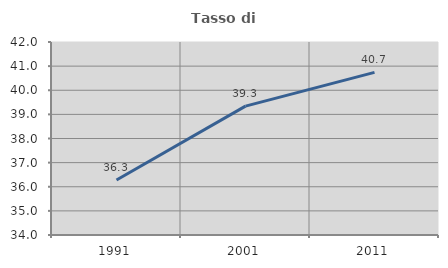
| Category | Tasso di occupazione   |
|---|---|
| 1991.0 | 36.282 |
| 2001.0 | 39.341 |
| 2011.0 | 40.741 |